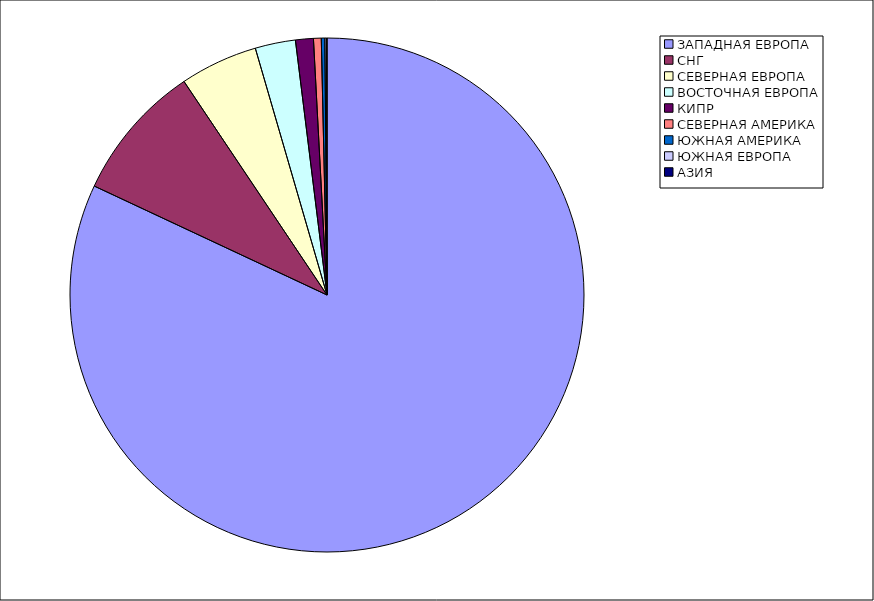
| Category | Оборот |
|---|---|
| ЗАПАДНАЯ ЕВРОПА | 0.82 |
| СНГ | 0.086 |
| СЕВЕРНАЯ ЕВРОПА | 0.049 |
| ВОСТОЧНАЯ ЕВРОПА | 0.025 |
| КИПР | 0.011 |
| СЕВЕРНАЯ АМЕРИКА | 0.005 |
| ЮЖНАЯ АМЕРИКА | 0.002 |
| ЮЖНАЯ ЕВРОПА | 0.001 |
| АЗИЯ | 0 |